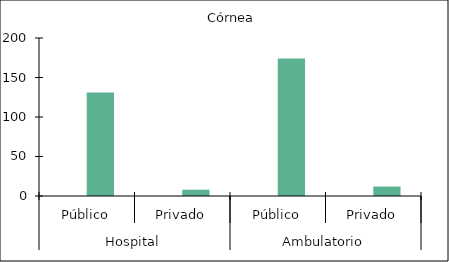
| Category |   |    Córnea |
|---|---|---|
| 0 | 0 | 131 |
| 1 | 0 | 8 |
| 2 | 0 | 174 |
| 3 | 0 | 12 |